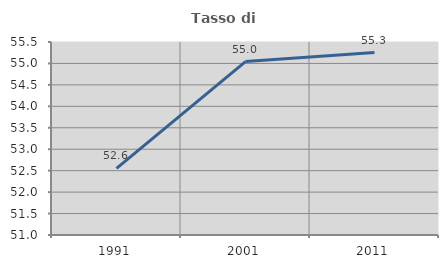
| Category | Tasso di occupazione   |
|---|---|
| 1991.0 | 52.552 |
| 2001.0 | 55.044 |
| 2011.0 | 55.254 |